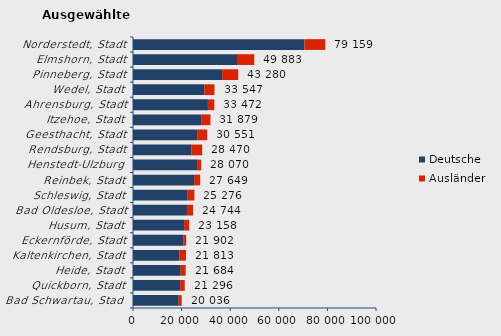
| Category | Deutsche | Ausländer | Series 2 |
|---|---|---|---|
| Bad Schwartau, Stadt | 18815 | 1221 | 20036 |
| Quickborn, Stadt | 19373 | 1923 | 21296 |
| Heide, Stadt | 19664 | 2020 | 21684 |
| Kaltenkirchen, Stadt | 19191 | 2622 | 21813 |
| Eckernförde, Stadt | 20857 | 1045 | 21902 |
| Husum, Stadt | 21019 | 2139 | 23158 |
| Bad Oldesloe, Stadt | 22207 | 2537 | 24744 |
| Schleswig, Stadt | 22517 | 2759 | 25276 |
| Reinbek, Stadt | 25130 | 2519 | 27649 |
| Henstedt-Ulzburg | 26358 | 1712 | 28070 |
| Rendsburg, Stadt | 23967 | 4503 | 28470 |
| Geesthacht, Stadt | 26384 | 4167 | 30551 |
| Itzehoe, Stadt | 28276 | 3603 | 31879 |
| Ahrensburg, Stadt | 30836 | 2636 | 33472 |
| Wedel, Stadt | 29318 | 4229 | 33547 |
| Pinneberg, Stadt | 36670 | 6610 | 43280 |
| Elmshorn, Stadt | 42803 | 7080 | 49883 |
| Norderstedt, Stadt | 70567 | 8592 | 79159 |